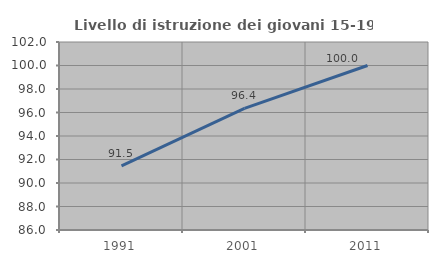
| Category | Livello di istruzione dei giovani 15-19 anni |
|---|---|
| 1991.0 | 91.463 |
| 2001.0 | 96.356 |
| 2011.0 | 100 |